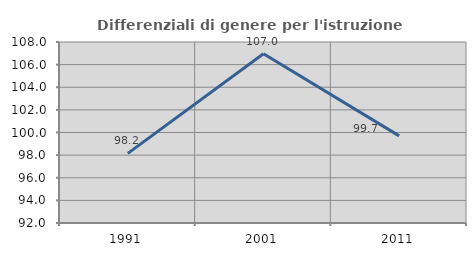
| Category | Differenziali di genere per l'istruzione superiore |
|---|---|
| 1991.0 | 98.152 |
| 2001.0 | 106.954 |
| 2011.0 | 99.704 |